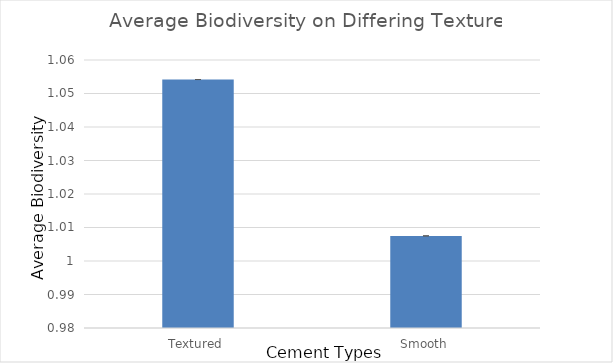
| Category | Series 0 |
|---|---|
| Textured | 1.054 |
| Smooth | 1.008 |